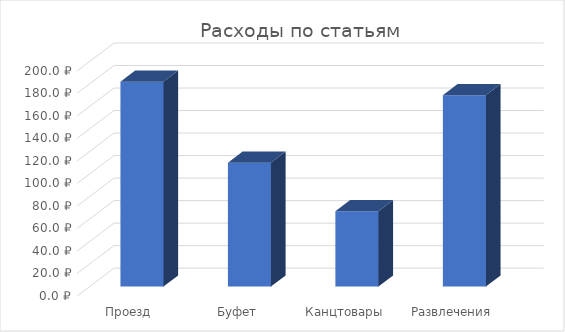
| Category | Расходы по статьям |
|---|---|
| Проезд | 182 |
| Буфет | 110 |
| Канцтовары | 67 |
| Развлечения | 170 |